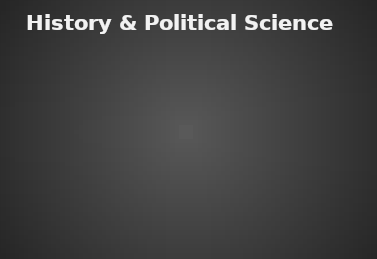
| Category | History & Political Science |
|---|---|
| % of Students passed | 0 |
| % of Students need improvement | 0 |